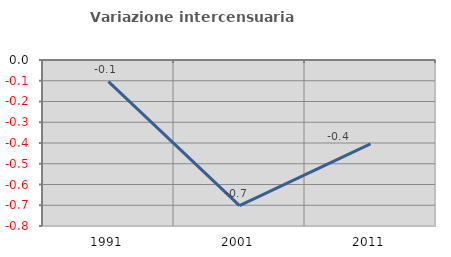
| Category | Variazione intercensuaria annua |
|---|---|
| 1991.0 | -0.104 |
| 2001.0 | -0.701 |
| 2011.0 | -0.404 |